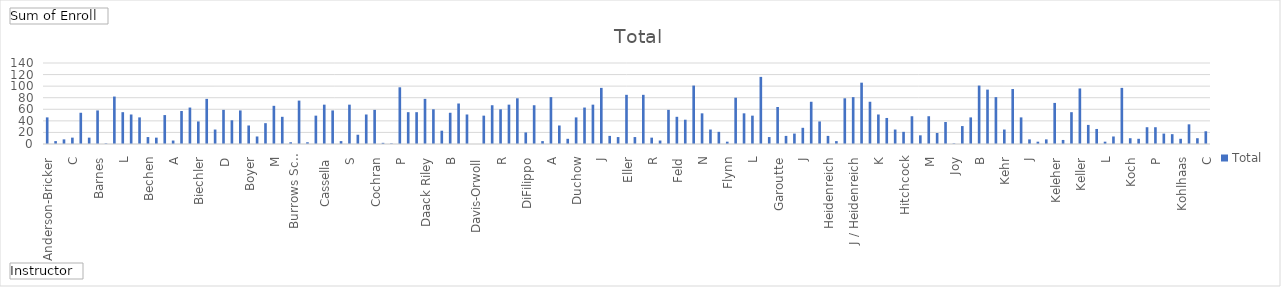
| Category | Total |
|---|---|
| Anderson-Bricker, K | 46 |
| Ausuri, C | 5 |
| Bales, S | 8 |
| Barnes, K | 11 |
| Bartgis, L | 54 |
| Baumann, P | 11 |
| Bechen, M | 58 |
| Behrens, A | 1 |
| Bell, V | 82 |
| Biechler, E | 55 |
| Bir, D | 51 |
| Boddicker, L | 46 |
| Boyer, K | 12 |
| Buckingham, M | 11 |
| Budzisz, C | 50 |
| Burrows Schumacher, M / Keleher, K | 6 |
| Cassella, S | 57 |
| Choi, S | 63 |
| Clark, N | 39 |
| Cochran, D | 78 |
| Connolly, P | 25 |
| Crook, S | 59 |
| Daack Riley, R | 41 |
| Daigle, B | 58 |
| Darr, B | 32 |
| Davis-Orwoll, S | 13 |
| Decker, R | 36 |
| DeShaw, K | 66 |
| DiFilippo, E | 47 |
| Dolan, A | 3 |
| Donovan, A | 75 |
| Duchow, A | 3 |
| Eby, J | 49 |
| Edwards, C | 68 |
| Eller, E | 58 |
| Fabricius, R | 5 |
| Farren-Eller, K | 68 |
| Feld, S | 16 |
| Fett, N | 51 |
| Figgins, M | 59 |
| Flynn, L | 2 |
| Gallagher, L | 1 |
| Gambrall, D | 98 |
| Garoutte, L | 55 |
| Gribben, J | 55 |
| Grinde, L | 78 |
| Heidenreich, J | 60 |
| Heidenreich, J / Heidenreich, K | 23 |
| Heidenreich, K | 54 |
| Heo, Y | 70 |
| Hitchcock, W | 51 |
| Iwasaki, M | 0 |
| Jablonsky, W | 49 |
| Joy, A | 67 |
| Kallback, B | 60 |
| Kanyusik, W | 68 |
| Kehr, A | 79 |
| Kehr, J | 20 |
| Kehren, M | 67 |
| Keleher, K / Burrows Schumacher, M | 5 |
| Keller, R | 81 |
| Kirsch, L | 32 |
| Kjelland, E | 9 |
| Koch, K | 46 |
| Kohl, P | 63 |
| Kohlhaas, A | 68 |
| Kohlhaas, J | 97 |
| Kuhl, C | 14 |
| Kult, T | 12 |
| Kurczek, J | 85 |
| Lahey, L | 12 |
| Lammer, L | 85 |
| Lammer-Heindel, C | 11 |
| Lansing, R | 6 |
| Lauritsen, K | 59 |
| Lipinski, T | 47 |
| Loui, K | 42 |
| Marx, A | 101 |
| Massena, A | 53 |
| Mauss, A | 25 |
| McCarthy-Gilmore, K | 21 |
| McElroy, D | 4 |
| McGovern, E | 80 |
| McLaughlin, K | 53 |
| Mederson, M | 49 |
| Moser, A | 116 |
| Mulligan, D | 12 |
| Myers, S | 64 |
| Nugent, C | 14 |
| O'Dea, D | 18 |
| Omarzu, J | 28 |
| Oostendorp, D | 73 |
| Osheim, A | 39 |
| Parks, K | 14 |
| Pettitt, H | 5 |
| Phillipson, T | 79 |
| Pillers, R | 81 |
| Pitt, D | 106 |
| Pohland, G | 73 |
| Pollock, J | 51 |
| Pullara, M | 45 |
| Reed, J | 25 |
| Resnick, D | 21 |
| Reynolds, A | 48 |
| Salyer, D | 15 |
| Schaefer, C | 48 |
| Scheuerell, S | 19 |
| Schilder, S | 38 |
| Schultz, U | 1 |
| Schultz, U / Shealer, D | 31 |
| Shealer, D | 46 |
| Shearrow, D | 101 |
| Shin, S | 94 |
| Sinha, A | 81 |
| Slade, T | 25 |
| Smith, J | 95 |
| Smith, R | 46 |
| Specht, J | 8 |
| Staff | 4 |
| Stanley, C | 8 |
| Stone, S | 71 |
| Stroiney, D | 7 |
| Sullivan, M | 55 |
| Taylor, B | 96 |
| Tebon, C | 33 |
| Theixos, H | 26 |
| Thompson, K | 4 |
| Thompson, M | 13 |
| Thraen-Borowski, K | 97 |
| Tringale, A | 10 |
| Tuescher, K | 9 |
| Utt, N | 29 |
| VanLaningham, E | 29 |
| Walsh, K | 18 |
| Weber, J | 17 |
| Weber, K | 9 |
| Welsh, H | 34 |
| Winkel, M | 10 |
| Wooden, S | 22 |